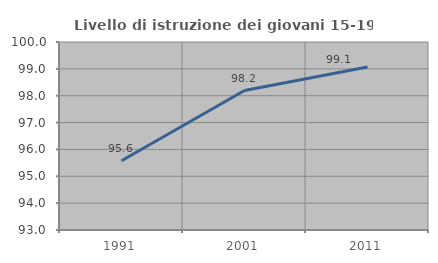
| Category | Livello di istruzione dei giovani 15-19 anni |
|---|---|
| 1991.0 | 95.576 |
| 2001.0 | 98.192 |
| 2011.0 | 99.07 |